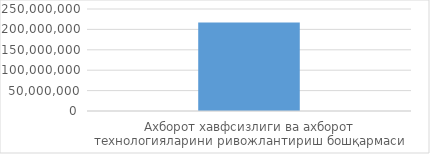
| Category | Товар / хизматнинг
жами суммаси
(cумда) 
(ҚҚС билан) |
|---|---|
| Ахборот хавфсизлиги ва ахборот технологияларини ривожлантириш бошқармаси | 216775000 |